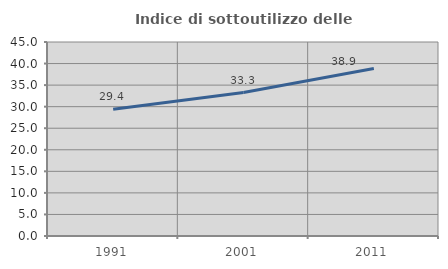
| Category | Indice di sottoutilizzo delle abitazioni  |
|---|---|
| 1991.0 | 29.393 |
| 2001.0 | 33.283 |
| 2011.0 | 38.857 |